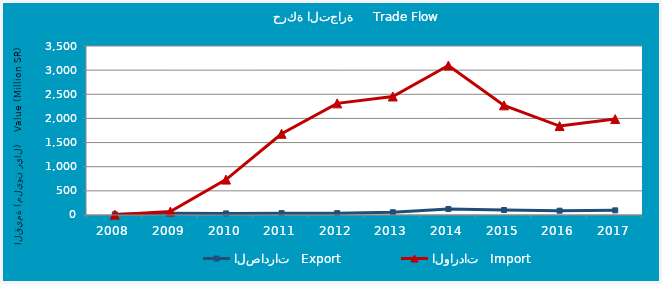
| Category | الصادرات   Export | الواردات   Import |
|---|---|---|
| 2008.0 | 13252687 | 6475688 |
| 2009.0 | 35864734 | 71573537 |
| 2010.0 | 33076492 | 733086668 |
| 2011.0 | 38413509 | 1682372784 |
| 2012.0 | 38683513 | 2311903518 |
| 2013.0 | 57383230 | 2454383721 |
| 2014.0 | 124360867 | 3095665556 |
| 2015.0 | 103469891 | 2270946349 |
| 2016.0 | 89131733 | 1841772179 |
| 2017.0 | 96292360 | 1986562515 |